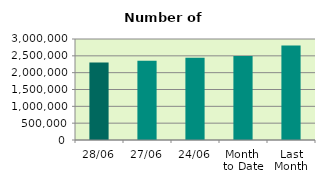
| Category | Series 0 |
|---|---|
| 28/06 | 2304608 |
| 27/06 | 2352224 |
| 24/06 | 2441144 |
| Month 
to Date | 2498646.2 |
| Last
Month | 2808947.182 |